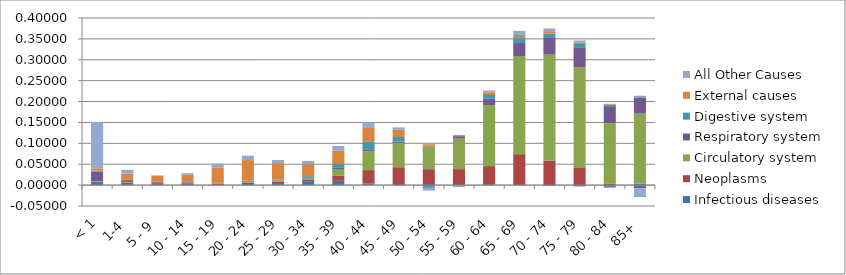
| Category | Infectious diseases  | Neoplasms | Circulatory system | Respiratory system  | Digestive system  | External causes  | All Other Causes |
|---|---|---|---|---|---|---|---|
| < 1 | 0.007 | 0.001 | 0.001 | 0.023 | 0.002 | 0.006 | 0.111 |
| 1-4 | 0.002 | 0.004 | 0.002 | 0.004 | 0.001 | 0.015 | 0.009 |
| 5 - 9 | 0.003 | 0.004 | 0 | 0.001 | 0 | 0.015 | 0.001 |
| 10 - 14 | 0.004 | 0.002 | 0 | 0.001 | 0 | 0.016 | 0.003 |
| 15 - 19 | 0 | 0.003 | 0.001 | 0.001 | 0 | 0.037 | 0.009 |
| 20 - 24 | 0.003 | 0.003 | 0.003 | 0.002 | 0 | 0.049 | 0.01 |
| 25 - 29 | 0.005 | 0.003 | 0.003 | 0.002 | 0 | 0.039 | 0.007 |
| 30 - 34 | 0.009 | 0.004 | 0.004 | 0.002 | 0.002 | 0.028 | 0.008 |
| 35 - 39 | 0.01 | 0.012 | 0.016 | 0.003 | 0.009 | 0.032 | 0.012 |
| 40 - 44 | 0.004 | 0.032 | 0.045 | 0.005 | 0.018 | 0.033 | 0.013 |
| 45 - 49 | 0 | 0.043 | 0.058 | 0.003 | 0.011 | 0.017 | 0.006 |
| 50 - 54 | -0.002 | 0.038 | 0.055 | 0.002 | -0.004 | 0.003 | -0.007 |
| 55 - 59 | 0 | 0.038 | 0.073 | 0.006 | -0.001 | 0.003 | -0.004 |
| 60 - 64 | 0.001 | 0.045 | 0.146 | 0.015 | 0.009 | 0.007 | 0.004 |
| 65 - 69 | 0 | 0.074 | 0.235 | 0.031 | 0.012 | 0.007 | 0.01 |
| 70 - 74 | -0.002 | 0.058 | 0.254 | 0.042 | 0.008 | 0.006 | 0.006 |
| 75 - 79 | -0.003 | 0.043 | 0.24 | 0.047 | 0.008 | 0.004 | 0.005 |
| 80 - 84 | -0.004 | 0.003 | 0.145 | 0.041 | 0.003 | 0.002 | -0.003 |
| 85+ | -0.007 | 0.003 | 0.168 | 0.038 | 0.003 | 0.001 | -0.021 |